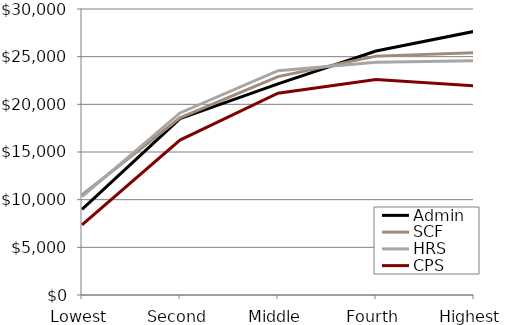
| Category | Admin | SCF | HRS | CPS |
|---|---|---|---|---|
| Lowest | 8982.699 | 10490.96 | 10315.86 | 7363.478 |
| Second | 18508.917 | 18575.43 | 19098.76 | 16246.94 |
| Middle | 22147.209 | 22911.38 | 23534.29 | 21167.755 |
| Fourth | 25594.781 | 25057.22 | 24424.38 | 22606.725 |
| Highest | 27645.776 | 25426.61 | 24574.35 | 21954.105 |